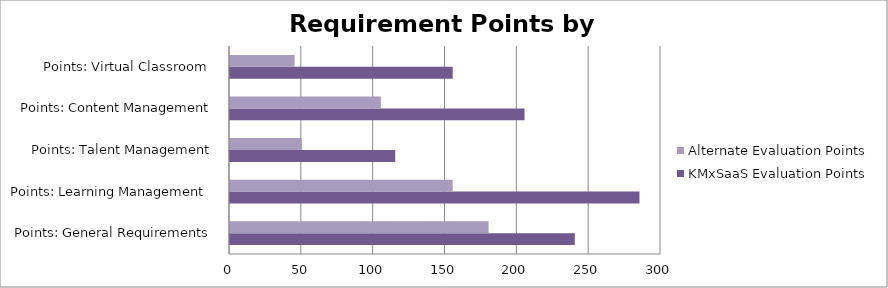
| Category | KMxSaaS Evaluation Points | Alternate Evaluation Points |
|---|---|---|
| Points: General Requirements | 240 | 180 |
| Points: Learning Management  | 285 | 155 |
| Points: Talent Management | 115 | 50 |
| Points: Content Management | 205 | 105 |
| Points: Virtual Classroom  | 155 | 45 |